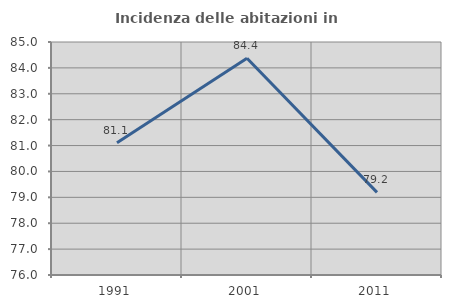
| Category | Incidenza delle abitazioni in proprietà  |
|---|---|
| 1991.0 | 81.111 |
| 2001.0 | 84.373 |
| 2011.0 | 79.19 |